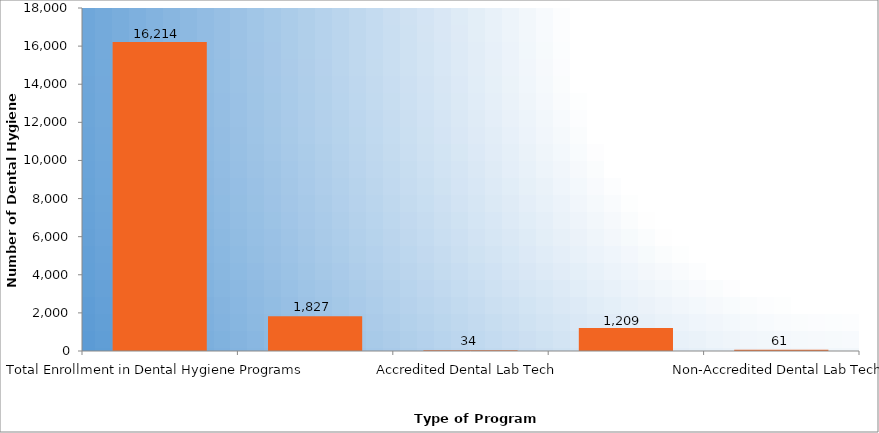
| Category | Number of Dental Hygiene Students |
|---|---|
| Total Enrollment in Dental Hygiene Programs | 16214 |
| Accredited Dental Assisting | 1827 |
| Accredited Dental Lab Tech | 34 |
| Non-Accredited Dental Assisting | 1209 |
| Non-Accredited Dental Lab Tech | 62 |